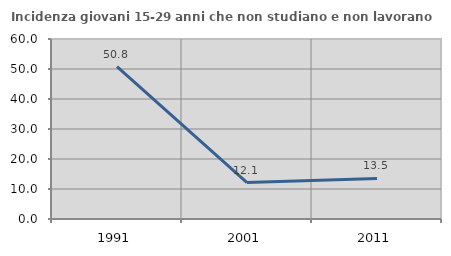
| Category | Incidenza giovani 15-29 anni che non studiano e non lavorano  |
|---|---|
| 1991.0 | 50.82 |
| 2001.0 | 12.128 |
| 2011.0 | 13.532 |